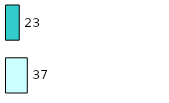
| Category | Series 0 | Series 1 |
|---|---|---|
| 0 | 37 | 23 |